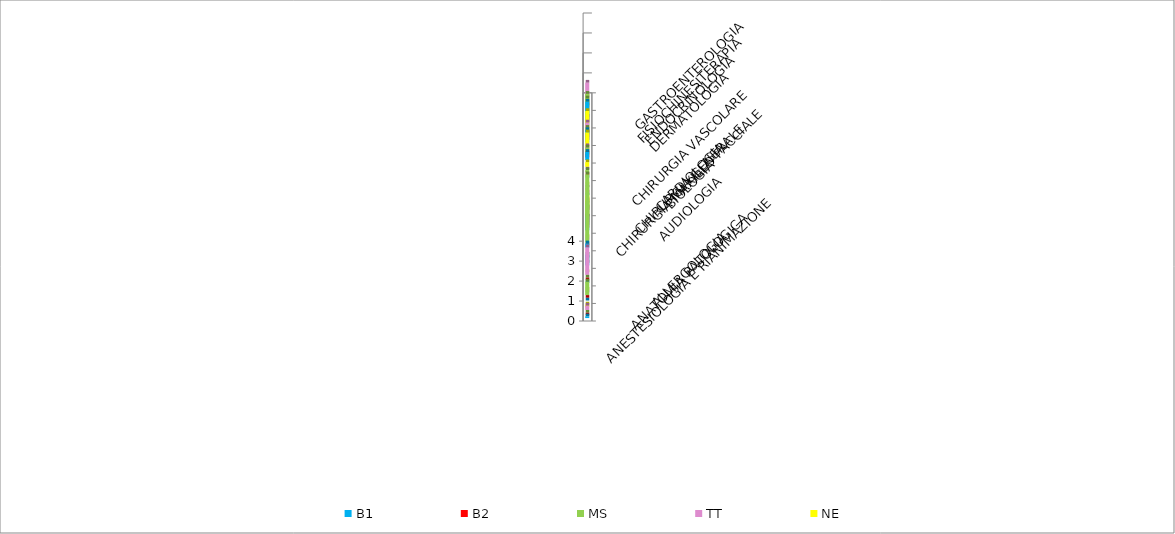
| Category | B1 | B2 | MS | TT | NE |
|---|---|---|---|---|---|
| ALLERGOLOGIA | 0.086 | 0 | 0 | 0.219 | 0.142 |
| ANATOMIA PATOLOGICA | 0 | 0 | 0.684 | 0 | 0 |
| ANESTESIOLOGIA E RIANIMAZIONE | 0 | 0 | 0 | 1.386 | 0 |
| AUDIOLOGIA | 0.543 | 0 | 0.108 | 0 | 0 |
| BIOLOGIA | 0.228 | 0 | 3.418 | 0 | 0 |
| CARDIOLOGIA | 0.7 | 0.552 | 1.079 | 0.638 | 1.205 |
| CHIRURGIA GENERALE | 0.3 | 0.121 | 0.297 | 0.219 | 0.142 |
| CHIRURGIA MAXILLO FACCIALE | 0 | 0 | 0.108 | 0 | 0 |
| CHIRURGIA VASCOLARE | 0 | 0 | 0.108 | 0 | 0.236 |
| DERMATOLOGIA | 0.414 | 0.173 | 0.36 | 0.292 | 0.851 |
| ENDOCRINOLOGIA | 0.628 | 0.345 | 0.468 | 0.602 | 1.04 |
| FISIOCHINESITERAPIA | 1.171 | 0.276 | 1.061 | 0.729 | 0.378 |
| GASTROENTEROLOGIA | 0.1 | 0 | 0.414 | 0.839 | 0 |